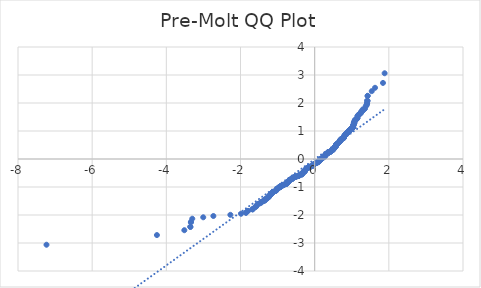
| Category | Series 0 |
|---|---|
| 0.046803513848261806 | -0.138 |
| -0.30787682704215447 | -0.481 |
| 1.0443419726025582 | 1.21 |
| 0.5862131989524377 | 0.518 |
| 0.1354735990708672 | -0.061 |
| -0.08620161398564416 | -0.256 |
| 0.28325707444187403 | 0.138 |
| 0.6896616317121429 | 0.656 |
| -1.0467942038971887 | -1.133 |
| -0.1453150041340467 | -0.273 |
| 0.8743909759259015 | 0.944 |
| 0.34975963835882545 | 0.205 |
| -0.6034437777841681 | -0.704 |
| 0.7783317169347462 | 0.747 |
| 0.8670018021573495 | 0.919 |
| 0.08374938269101352 | -0.11 |
| -0.16748252543969752 | -0.302 |
| 0.15025194660796704 | -0.039 |
| -1.275858590722249 | -1.404 |
| 1.1477904053622634 | 1.449 |
| -0.20442839428244924 | -0.325 |
| -0.7068922105438724 | -0.799 |
| -0.6403896466269199 | -0.726 |
| 1.0886770152138598 | 1.389 |
| 1.0369527988340081 | 1.133 |
| -1.3349719808706515 | -1.465 |
| 0.09113855645956345 | -0.105 |
| 0.7857208907032961 | 0.777 |
| 0.6231590677951894 | 0.55 |
| 0.5270998088040342 | 0.39 |
| 1.0443419726025582 | 1.21 |
| 1.2586280118905184 | 1.695 |
| -1.5788147152328138 | -1.695 |
| -0.3522118696534561 | -0.55 |
| 0.6453265891008392 | 0.582 |
| -0.6773355154696716 | -0.762 |
| 0.7339966743234446 | 0.718 |
| 1.0886770152138598 | 1.389 |
| 0.5197106350354842 | 0.372 |
| -0.9137890760632829 | -0.962 |
| 0.9556718873799549 | 1.034 |
| -1.135464289119793 | -1.198 |
| 0.7118291530177927 | 0.704 |
| 0.37931633343302723 | 0.233 |
| 0.5270998088040342 | 0.39 |
| -0.6182221253212691 | -0.711 |
| -3.337438072147795 | -2.254 |
| 1.0369527988340081 | 1.133 |
| -0.6403896466269199 | -0.726 |
| -1.800489928289324 | -1.854 |
| 0.5714348514153358 | 0.462 |
| 0.5714348514153358 | 0.462 |
| 0.024635992542612038 | -0.149 |
| 0.20936533675637062 | 0.05 |
| 1.4285790085671772 | 2.254 |
| 0.5418781563411361 | 0.426 |
| -0.06403409267999334 | -0.245 |
| -0.7068922105438724 | -0.799 |
| 1.0812878414453098 | 1.375 |
| 0.23892203183057031 | 0.061 |
| 1.0369527988340081 | 1.133 |
| -1.8522141446691756 | -1.919 |
| -0.5812762564785173 | -0.662 |
| 1.8423727396059961 | 2.717 |
| 0.549267330109686 | 0.444 |
| -0.2561526106623018 | -0.414 |
| -0.056644918911443416 | -0.233 |
| 0.28325707444187403 | 0.138 |
| 0.11330607776521531 | -0.083 |
| 1.06650949390821 | 1.294 |
| -0.21181756805100022 | -0.343 |
| 0.31281376951607376 | 0.166 |
| -0.08620161398564416 | -0.256 |
| 1.1551795791308133 | 1.515 |
| 0.7561641956290943 | 0.733 |
| 0.5788240251838878 | 0.499 |
| 1.1477904053622634 | 1.449 |
| 1.0369527988340081 | 1.133 |
| 0.275867900673322 | 0.11 |
| -0.004920702531589754 | -0.177 |
| 1.1625687528993631 | 1.551 |
| 0.5714348514153358 | 0.462 |
| 0.8226667595460478 | 0.861 |
| -0.7955622957664767 | -0.902 |
| 1.4138006610300753 | 1.994 |
| 0.5418781563411361 | 0.426 |
| -0.03447739760579155 | -0.211 |
| -0.743838079386624 | -0.869 |
| 0.4236513760443289 | 0.262 |
| -0.30787682704215447 | -0.481 |
| -0.758616426923725 | -0.886 |
| 0.275867900673322 | 0.11 |
| 0.7931100644718461 | 0.807 |
| -0.03447739760579155 | -0.211 |
| -0.10097996152274506 | -0.268 |
| -7.231532648173826 | -3.062 |
| -1.6083714103070144 | -1.718 |
| 1.0443419726025582 | 1.21 |
| 0.25370037936767226 | 0.088 |
| -1.135464289119793 | -1.198 |
| -0.7068922105438724 | -0.799 |
| 0.24631120559912234 | 0.077 |
| -0.758616426923725 | -0.886 |
| 0.7931100644718461 | 0.807 |
| -0.2561526106623018 | -0.414 |
| 0.6822724579435909 | 0.642 |
| 1.07389866767676 | 1.361 |
| 0.09113855645956345 | -0.105 |
| 0.9852285824541567 | 1.082 |
| -0.26354178443085174 | -0.42 |
| 0.061581861385363756 | -0.133 |
| 1.3990223134929756 | 1.919 |
| -1.0098483350544372 | -1.063 |
| 0.6896616317121429 | 0.656 |
| -0.743838079386624 | -0.869 |
| 0.9556718873799549 | 1.034 |
| 0.7413858480919945 | 0.726 |
| 0.8448342808516998 | 0.886 |
| 0.2980354219789739 | 0.16 |
| 0.9556718873799549 | 1.034 |
| 1.06650949390821 | 1.294 |
| 0.31281376951607376 | 0.166 |
| 0.4236513760443289 | 0.262 |
| -0.44827112864461033 | -0.608 |
| -2.273397049476545 | -1.994 |
| -0.4187144335704096 | -0.589 |
| 0.8670018021573495 | 0.919 |
| -0.4334927811075105 | -0.595 |
| -0.49260617125591305 | -0.622 |
| -0.7216705580809732 | -0.838 |
| 1.4211898347986252 | 2.082 |
| 0.1724194679136189 | 0.006 |
| -0.2561526106623018 | -0.414 |
| -0.6921138630067725 | -0.769 |
| -1.0320158563600879 | -1.112 |
| 0.4605972448870806 | 0.296 |
| -0.3374335221163552 | -0.524 |
| 0.34975963835882545 | 0.205 |
| -0.8472865121463293 | -0.936 |
| -0.9359565973689337 | -1.006 |
| -0.5369412138672147 | -0.642 |
| 0.9187260185372031 | 0.997 |
| 0.4901539399612824 | 0.331 |
| -0.5960546040156172 | -0.69 |
| 0.5270998088040342 | 0.39 |
| 0.4605972448870806 | 0.296 |
| 0.5123214612669342 | 0.36 |
| 0.1354735990708672 | -0.061 |
| 0.2019761629878186 | 0.028 |
| 0.31281376951607376 | 0.166 |
| 0.5862131989524377 | 0.518 |
| -1.0320158563600879 | -1.112 |
| -1.2315235481109474 | -1.347 |
| -0.2561526106623018 | -0.414 |
| 0.2684787269047721 | 0.099 |
| -0.24137426312520094 | -0.366 |
| -0.2783201319679527 | -0.444 |
| 0.4236513760443289 | 0.262 |
| 0.12808442530231517 | -0.072 |
| -0.5960546040156172 | -0.69 |
| -1.0763508989713895 | -1.144 |
| 0.4827647661927325 | 0.319 |
| -0.6699463417011207 | -0.754 |
| -1.135464289119793 | -1.198 |
| -0.027088223837241625 | -0.194 |
| 0.6305482415637393 | 0.563 |
| 0.25370037936767226 | 0.088 |
| -0.2783201319679527 | -0.444 |
| -1.4901446300102095 | -1.589 |
| -1.4384204136303567 | -1.551 |
| -1.3645286759448534 | -1.498 |
| -0.8325081646092284 | -0.919 |
| -0.7142813843124234 | -0.822 |
| 1.2881847069647203 | 1.718 |
| -1.3275828071021016 | -1.434 |
| 0.549267330109686 | 0.444 |
| -1.1871885054996447 | -1.269 |
| 0.8522234546202496 | 0.91 |
| -1.549258020158612 | -1.629 |
| -0.7955622957664767 | -0.902 |
| -3.352216419684896 | -2.423 |
| -0.9359565973689337 | -1.006 |
| -0.9359565973689337 | -1.006 |
| 0.16503029414506687 | -0.006 |
| -0.5960546040156172 | -0.69 |
| -1.275858590722249 | -1.404 |
| 0.23892203183057031 | 0.061 |
| -0.5960546040156172 | -0.69 |
| 0.37931633343302723 | 0.233 |
| -0.4187144335704096 | -0.589 |
| 0.9852285824541567 | 1.082 |
| -1.4384204136303567 | -1.551 |
| -1.674873974223968 | -1.796 |
| -0.5073845187930139 | -0.635 |
| -1.2315235481109474 | -1.347 |
| -2.731525823126667 | -2.036 |
| 0.6896616317121429 | 0.656 |
| 0.8670018021573495 | 0.919 |
| 0.4310405498128809 | 0.279 |
| 1.0369527988340081 | 1.133 |
| 0.6601049366379411 | 0.602 |
| 1.4211898347986252 | 2.082 |
| -0.2709309581994027 | -0.432 |
| -0.9876808137487862 | -1.044 |
| -1.5788147152328138 | -1.695 |
| 0.275867900673322 | 0.11 |
| 0.7857208907032961 | 0.777 |
| -0.743838079386624 | -0.869 |
| -0.4408819548760604 | -0.602 |
| 0.19458698921926867 | 0.017 |
| 0.940893539842853 | 1.025 |
| -1.0320158563600879 | -1.112 |
| 0.9187260185372031 | 0.997 |
| 0.49754311372983234 | 0.337 |
| -0.34482269588490616 | -0.537 |
| -0.2930984795050536 | -0.468 |
| 1.1330120578251635 | 1.434 |
| 1.2364604905848666 | 1.629 |
| 0.2019761629878186 | 0.028 |
| 0.7857208907032961 | 0.777 |
| -0.5443303876357657 | -0.649 |
| 0.1059169039966654 | -0.088 |
| 0.31281376951607376 | 0.166 |
| 0.8226667595460478 | 0.861 |
| 0.15025194660796704 | -0.039 |
| 1.3768547921873235 | 1.886 |
| 0.16503029414506687 | -0.006 |
| -0.21920674181955013 | -0.354 |
| -0.2930984795050536 | -0.468 |
| 0.31281376951607376 | 0.166 |
| 1.3472980971131219 | 1.796 |
| 0.8300559333145978 | 0.877 |
| -1.0320158563600879 | -1.112 |
| 0.6674941104064911 | 0.608 |
| -0.3374335221163552 | -0.524 |
| 0.44581889734998076 | 0.291 |
| -0.8694540334519801 | -0.944 |
| 0.8448342808516998 | 0.886 |
| -0.8325081646092284 | -0.919 |
| -0.2930984795050536 | -0.468 |
| -1.0467942038971887 | -1.133 |
| 0.556656503878236 | 0.456 |
| 1.8867077822172977 | 3.062 |
| -3.352216419684896 | -2.423 |
| 0.4310405498128809 | 0.279 |
| -0.16748252543969752 | -0.302 |
| -1.4679771087045586 | -1.57 |
| 0.6674941104064911 | 0.608 |
| 1.0000069299912566 | 1.112 |
| -0.24137426312520094 | -0.366 |
| 0.5862131989524377 | 0.518 |
| 0.6896616317121429 | 0.656 |
| -0.3522118696534561 | -0.55 |
| 0.6970508054806929 | 0.697 |
| 0.1354735990708672 | -0.061 |
| -3.5147782425930028 | -2.543 |
| -0.3374335221163552 | -0.524 |
| -1.674873974223968 | -1.796 |
| 0.11330607776521531 | -0.083 |
| -1.2610802431851482 | -1.361 |
| 1.1477904053622634 | 1.449 |
| 0.275867900673322 | 0.11 |
| 0.39409468097012923 | 0.251 |
| 1.5394166150954325 | 2.423 |
| 0.1354735990708672 | -0.061 |
| -4.253695619448037 | -2.717 |
| -0.3374335221163552 | -0.524 |
| 0.024635992542612038 | -0.149 |
| -1.5788147152328138 | -1.695 |
| -1.800489928289324 | -1.854 |
| 1.0369527988340081 | 1.133 |
| 1.0886770152138598 | 1.389 |
| -1.416252892324706 | -1.515 |
| 0.9113368447686532 | 0.962 |
| 0.2684787269047721 | 0.099 |
| 0.4605972448870806 | 0.296 |
| -1.0320158563600879 | -1.112 |
| -0.7364489056180742 | -0.846 |
| 1.2512388381219686 | 1.672 |
| 0.6674941104064911 | 0.608 |
| 0.6083807202580874 | 0.543 |
| -0.9802916399802353 | -1.034 |
| -0.9802916399802353 | -1.034 |
| -0.49260617125591305 | -0.622 |
| 0.7857208907032961 | 0.777 |
| 1.06650949390821 | 1.294 |
| 0.7783317169347462 | 0.747 |
| -0.21181756805100022 | -0.343 |
| 1.2142929692792168 | 1.609 |
| -0.2561526106623018 | -0.414 |
| -0.35960104342200705 | -0.556 |
| 0.061581861385363756 | -0.133 |
| 0.6822724579435909 | 0.642 |
| 0.6674941104064911 | 0.608 |
| -0.8472865121463293 | -0.936 |
| -1.2019668530367456 | -1.282 |
| 0.9630610611485048 | 1.063 |
| 0.5714348514153358 | 0.462 |
| 1.1477904053622634 | 1.449 |
| -1.157631810425444 | -1.221 |
| 0.28325707444187403 | 0.138 |
| 0.5418781563411361 | 0.426 |
| 0.061581861385363756 | -0.133 |
| 0.0763602089224636 | -0.116 |
| -0.2930984795050536 | -0.468 |
| -0.6551679941640208 | -0.733 |
| -1.1871885054996447 | -1.269 |
| 0.2019761629878186 | 0.028 |
| 0.24631120559912234 | 0.077 |
| -3.3004922033050437 | -2.132 |
| -1.3349719808706515 | -1.465 |
| 0.9113368447686532 | 0.962 |
| 0.15025194660796704 | -0.039 |
| -0.6699463417011207 | -0.754 |
| 0.2019761629878186 | 0.028 |
| -0.20442839428244924 | -0.325 |
| 0.7783317169347462 | 0.747 |
| -0.21920674181955013 | -0.354 |
| -0.004920702531589754 | -0.177 |
| 0.7561641956290943 | 0.733 |
| -1.0098483350544372 | -1.063 |
| -0.012309876300139678 | -0.188 |
| 0.5123214612669342 | 0.36 |
| 0.22414368429347048 | 0.055 |
| -1.157631810425444 | -1.221 |
| -1.8522141446691756 | -1.919 |
| 0.8891693234630014 | 0.953 |
| 0.6896616317121429 | 0.656 |
| 1.4285790085671772 | 2.254 |
| -0.7216705580809732 | -0.838 |
| 0.534488982572584 | 0.414 |
| -0.0492557451428914 | -0.222 |
| 1.4138006610300753 | 1.994 |
| 0.9113368447686532 | 0.962 |
| 0.5788240251838878 | 0.499 |
| 0.815277585777498 | 0.846 |
| -0.0492557451428914 | -0.222 |
| 0.3202029432846258 | 0.2 |
| 1.192125447973565 | 1.589 |
| -1.3571395021763033 | -1.482 |
| -1.1724101579625448 | -1.245 |
| -0.20442839428244924 | -0.325 |
| 0.6379374153322893 | 0.576 |
| -1.1724101579625448 | -1.245 |
| 0.34975963835882545 | 0.205 |
| -0.3374335221163552 | -0.524 |
| -0.012309876300139678 | -0.188 |
| -0.7142813843124234 | -0.822 |
| 0.5714348514153358 | 0.462 |
| 0.7783317169347462 | 0.747 |
| 0.4605972448870806 | 0.296 |
| -0.33004434834780527 | -0.493 |
| 0.416262202275779 | 0.256 |
| 0.275867900673322 | 0.11 |
| -0.9359565973689337 | -1.006 |
| -1.9852192725030826 | -1.955 |
| 0.19458698921926867 | 0.017 |
| 1.2881847069647203 | 1.718 |
| -1.2684694169536992 | -1.375 |
| 0.09113855645956345 | -0.105 |
| -0.2561526106623018 | -0.414 |
| 0.6231590677951894 | 0.55 |
| -0.5073845187930139 | -0.635 |
| -1.2315235481109474 | -1.347 |
| 0.49754311372983234 | 0.337 |
| -0.004920702531589754 | -0.177 |
| 1.0443419726025582 | 1.21 |
| 0.6305482415637393 | 0.563 |
| -0.9137890760632829 | -0.962 |
| -0.6034437777841681 | -0.704 |
| 1.06650949390821 | 1.294 |
| 1.3472980971131219 | 1.796 |
| -1.2167452005738464 | -1.307 |
| 0.23892203183057031 | 0.061 |
| 0.15025194660796704 | -0.039 |
| 0.29064624821042395 | 0.155 |
| 0.6674941104064911 | 0.608 |
| 1.2955738807332702 | 1.769 |
| 0.7931100644718461 | 0.807 |
| -1.674873974223968 | -1.796 |
| 0.5862131989524377 | 0.518 |
| -1.3275828071021016 | -1.434 |
| -0.2561526106623018 | -0.414 |
| -0.6699463417011207 | -0.754 |
| 0.5270998088040342 | 0.39 |
| 0.15025194660796704 | -0.039 |
| -0.9655132924431343 | -1.015 |
| 1.4064114872615254 | 1.955 |
| -0.004920702531589754 | -0.177 |
| 0.815277585777498 | 0.846 |
| -0.004920702531589754 | -0.177 |
| 0.800499238240398 | 0.838 |
| 0.9630610611485048 | 1.063 |
| -0.1748716992082485 | -0.308 |
| 0.9852285824541567 | 1.082 |
| 0.17980864168216884 | 0.011 |
| 0.5197106350354842 | 0.372 |
| 0.31281376951607376 | 0.166 |
| 1.3472980971131219 | 1.796 |
| 0.49754311372983234 | 0.337 |
| -0.34482269588490616 | -0.537 |
| -1.527090498852961 | -1.609 |
| -0.2709309581994027 | -0.432 |
| -0.21181756805100022 | -0.343 |
| -0.10097996152274506 | -0.268 |
| -0.6995030367753224 | -0.777 |
| 0.6453265891008392 | 0.582 |
| 0.8448342808516998 | 0.886 |
| -0.06403409267999334 | -0.245 |
| 0.9261151923057531 | 1.015 |
| 0.6896616317121429 | 0.656 |
| 0.4827647661927325 | 0.319 |
| -0.15270417790259663 | -0.279 |
| 0.7266075005548946 | 0.711 |
| -0.16748252543969752 | -0.302 |
| -0.2561526106623018 | -0.414 |
| 0.15025194660796704 | -0.039 |
| -3.0049252525630297 | -2.082 |
| -1.135464289119793 | -1.198 |
| 1.06650949390821 | 1.294 |
| 1.051731146371108 | 1.269 |
| 1.0000069299912566 | 1.112 |
| 1.0591203201396602 | 1.282 |
| -0.4187144335704096 | -0.589 |
| 0.34975963835882545 | 0.205 |
| -1.2093560268052965 | -1.294 |
| -0.03447739760579155 | -0.211 |
| -1.135464289119793 | -1.198 |
| 0.6453265891008392 | 0.582 |
| 1.0443419726025582 | 1.21 |
| 0.49754311372983234 | 0.337 |
| 0.12808442530231517 | -0.072 |
| 1.2364604905848666 | 1.629 |
| -0.5664979089414165 | -0.656 |
| -3.337438072147795 | -2.254 |
| 1.6280867003180357 | 2.543 |
| 1.0369527988340081 | 1.133 |
| 0.5197106350354842 | 0.372 |
| -0.33004434834780527 | -0.493 |
| 0.534488982572584 | 0.414 |
| -0.4187144335704096 | -0.589 |
| 0.5714348514153358 | 0.462 |
| 1.177347100436465 | 1.57 |
| 0.7931100644718461 | 0.807 |
| -0.16748252543969752 | -0.302 |
| -0.7142813843124234 | -0.822 |
| -0.9359565973689337 | -1.006 |
| 0.9113368447686532 | 0.962 |
| 0.37931633343302723 | 0.233 |
| 0.5788240251838878 | 0.499 |
| 1.4211898347986252 | 2.082 |
| -0.41132525980185863 | -0.563 |
| -0.056644918911443416 | -0.233 |
| 0.34975963835882545 | 0.205 |
| 1.1551795791308133 | 1.515 |